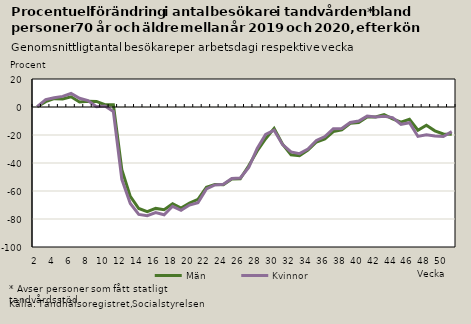
| Category | Män | Kvinnor |
|---|---|---|
| 2.0 | 0.118 | 0.199 |
| 3.0 | 3.812 | 5.346 |
| 4.0 | 5.941 | 6.617 |
| 5.0 | 5.719 | 7.567 |
| 6.0 | 7.291 | 9.654 |
| 7.0 | 3.61 | 6.248 |
| 8.0 | 4.166 | 4.632 |
| 9.0 | 4.001 | 0.152 |
| 10.0 | 1.691 | 0.745 |
| 11.0 | 1.589 | -3.2 |
| 12.0 | -44.815 | -51.665 |
| 13.0 | -63.835 | -68.924 |
| 14.0 | -72.526 | -76.72 |
| 15.0 | -74.678 | -77.608 |
| 16.0 | -72.437 | -75.429 |
| 17.0 | -73.376 | -77.001 |
| 18.0 | -69.112 | -70.916 |
| 19.0 | -72.194 | -73.761 |
| 20.0 | -68.553 | -70.047 |
| 21.0 | -65.935 | -68.412 |
| 22.0 | -57.332 | -58.536 |
| 23.0 | -55.313 | -55.684 |
| 24.0 | -55.59 | -55.233 |
| 25.0 | -51.505 | -51.062 |
| 26.0 | -51.346 | -50.734 |
| 27.0 | -41.982 | -43.212 |
| 28.0 | -31.408 | -29.552 |
| 29.0 | -22.639 | -19.637 |
| 30.0 | -15.28 | -16.549 |
| 31.0 | -26.579 | -26.889 |
| 32.0 | -34.165 | -32.123 |
| 33.0 | -34.779 | -33.32 |
| 34.0 | -30.821 | -30.018 |
| 35.0 | -24.988 | -23.893 |
| 36.0 | -22.831 | -21.124 |
| 37.0 | -17.512 | -15.459 |
| 38.0 | -16.331 | -15.318 |
| 39.0 | -11.616 | -11.031 |
| 40.0 | -11.172 | -10.002 |
| 41.0 | -7.176 | -6.522 |
| 42.0 | -7.187 | -7.193 |
| 43.0 | -5.45 | -6.637 |
| 44.0 | -8.481 | -7.591 |
| 45.0 | -10.901 | -12.357 |
| 46.0 | -8.759 | -11.188 |
| 47.0 | -16.571 | -21.036 |
| 48.0 | -13.022 | -19.849 |
| 49.0 | -17.044 | -20.682 |
| 50.0 | -19.247 | -21.068 |
| 51.0 | -19.463 | -17.603 |